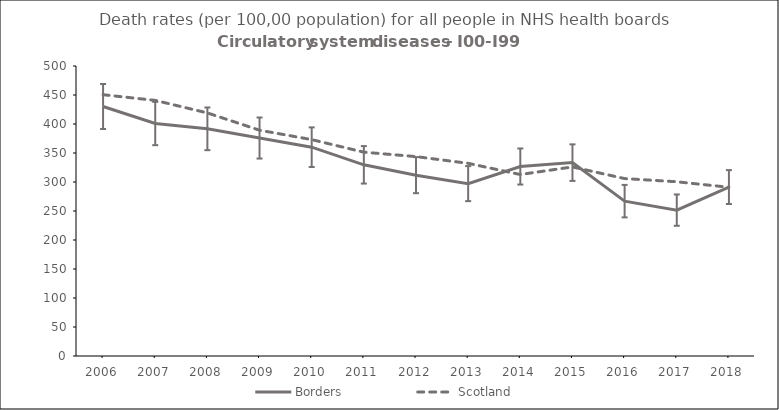
| Category | Borders | Scotland |
|---|---|---|
| 2006.0 | 430.2 | 450.5 |
| 2007.0 | 400.8 | 440.7 |
| 2008.0 | 391.7 | 419.1 |
| 2009.0 | 375.8 | 389.3 |
| 2010.0 | 360 | 373.1 |
| 2011.0 | 329.6 | 351.4 |
| 2012.0 | 311.8 | 343.8 |
| 2013.0 | 297.2 | 332.2 |
| 2014.0 | 326.7 | 312.9 |
| 2015.0 | 333.4 | 326 |
| 2016.0 | 267 | 305.9 |
| 2017.0 | 251.5 | 300.4 |
| 2018.0 | 291.3 | 290.9 |